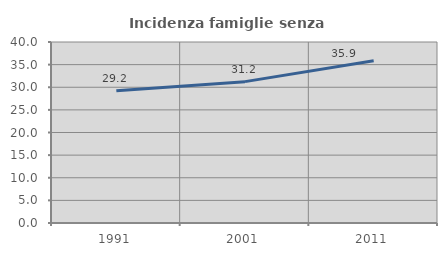
| Category | Incidenza famiglie senza nuclei |
|---|---|
| 1991.0 | 29.232 |
| 2001.0 | 31.241 |
| 2011.0 | 35.873 |